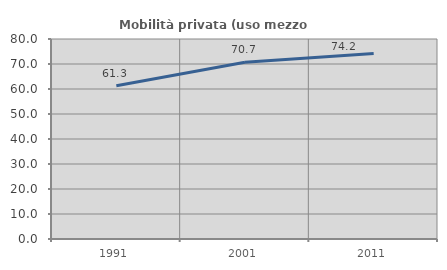
| Category | Mobilità privata (uso mezzo privato) |
|---|---|
| 1991.0 | 61.303 |
| 2001.0 | 70.715 |
| 2011.0 | 74.203 |